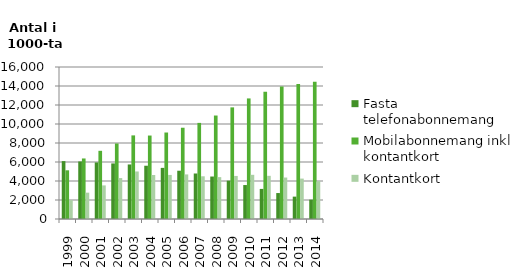
| Category | Fasta telefonabonnemang | Mobilabonnemang inkl. kontantkort | Kontantkort |
|---|---|---|---|
| 1999.0 | 6093 | 5126 | 1983 |
| 2000.0 | 6056 | 6372 | 2773 |
| 2001.0 | 5954 | 7178 | 3536 |
| 2002.0 | 5849 | 7949 | 4309 |
| 2003.0 | 5741 | 8801 | 5003 |
| 2004.0 | 5607 | 8785 | 4629 |
| 2005.0 | 5381 | 9104 | 4638 |
| 2006.0 | 5082 | 9607 | 4693 |
| 2007.0 | 4790 | 10117 | 4496 |
| 2008.0 | 4471 | 10892 | 4407 |
| 2009.0 | 4037 | 11750 | 4532 |
| 2010.0 | 3574 | 12692 | 4651 |
| 2011.0 | 3167 | 13395 | 4545 |
| 2012.0 | 2732 | 13946 | 4365 |
| 2013.0 | 2355 | 14199 | 4253 |
| 2014.0 | 2037 | 14440 | 3984 |